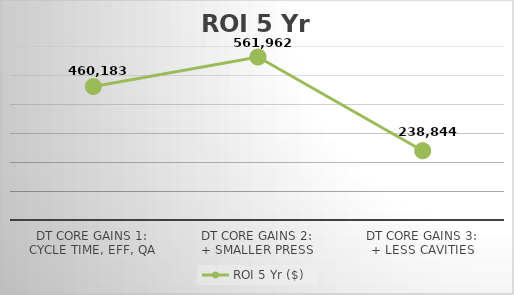
| Category | ROI 5 Yr ($) |
|---|---|
| DT Core Gains 1:
Cycle Time, Eff, QA | 460182.538 |
| DT Core Gains 2:
+ Smaller Press | 561962.052 |
| DT Core Gains 3:
+ Less Cavities | 238843.996 |